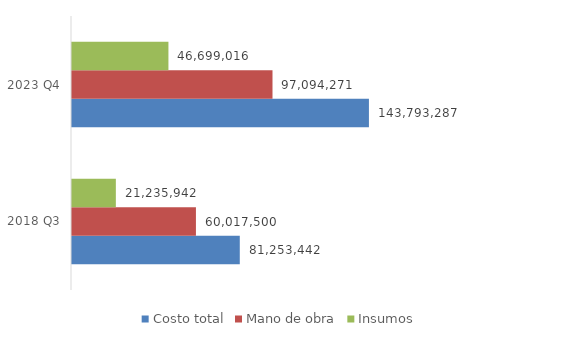
| Category | Costo total | Mano de obra | Insumos |
|---|---|---|---|
| 2018 Q3 | 81253442 | 60017500 | 21235942 |
| 2023 Q4 | 143793286.898 | 97094271 | 46699015.898 |